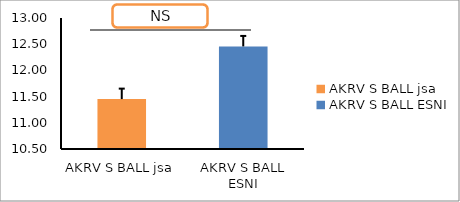
| Category | Series 0 |
|---|---|
| AKRV S BALL jsa | 11.452 |
| AKRV S BALL ESNI | 12.458 |